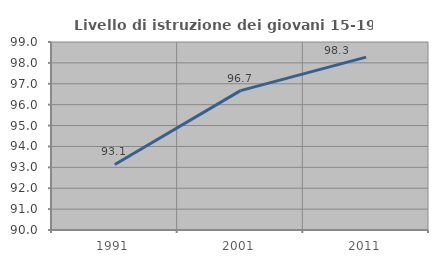
| Category | Livello di istruzione dei giovani 15-19 anni |
|---|---|
| 1991.0 | 93.138 |
| 2001.0 | 96.67 |
| 2011.0 | 98.276 |